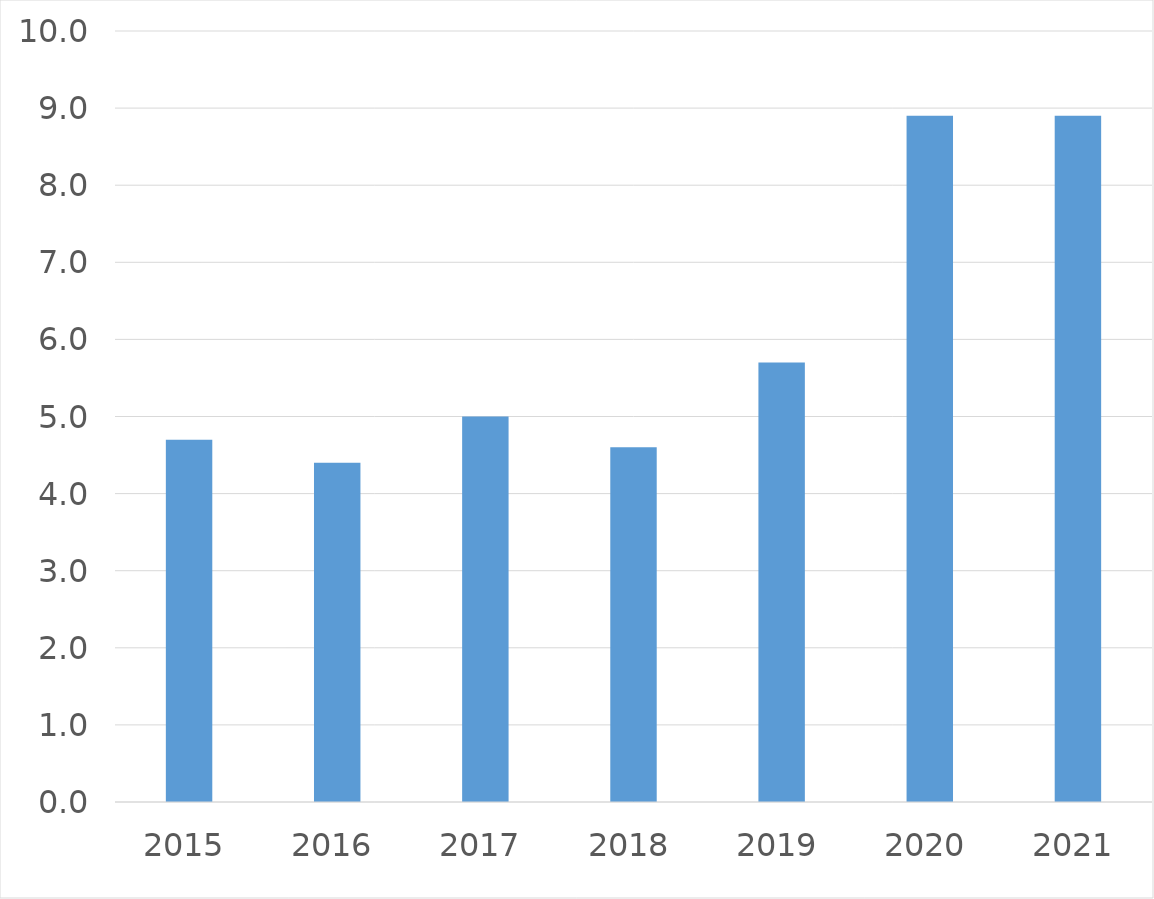
| Category | Series 0 |
|---|---|
| 2015 | 4.7 |
| 2016 | 4.4 |
| 2017 | 5 |
| 2018 | 4.6 |
| 2019 | 5.7 |
| 2020 | 8.9 |
| 2021 | 8.9 |